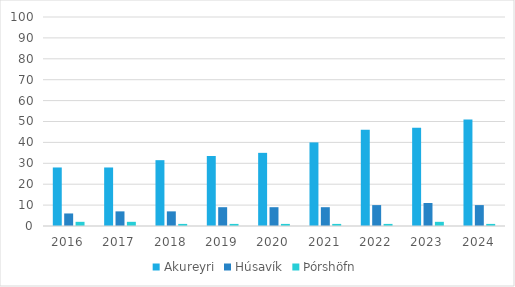
| Category | Akureyri | Húsavík | Þórshöfn |
|---|---|---|---|
| 2016 | 28 | 6 | 2 |
| 2017 | 28 | 7 | 2 |
| 2018 | 31.5 | 7 | 1 |
| 2019 | 33.5 | 9 | 1 |
| 2020 | 35 | 9 | 1 |
| 2021 | 40 | 9 | 1 |
| 2022 | 46 | 10 | 1 |
| 2023 | 47 | 11 | 2 |
| 2024 | 51 | 10 | 1 |